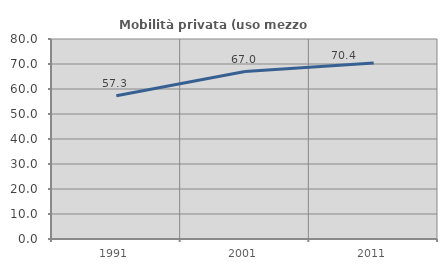
| Category | Mobilità privata (uso mezzo privato) |
|---|---|
| 1991.0 | 57.283 |
| 2001.0 | 66.981 |
| 2011.0 | 70.408 |